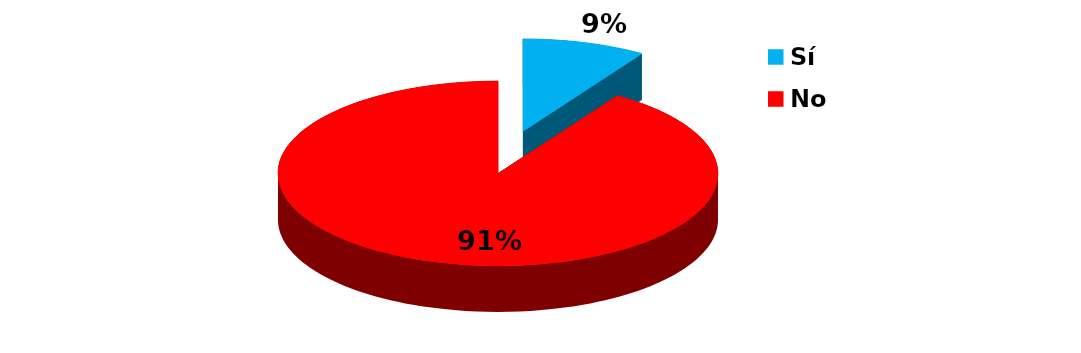
| Category | Series 0 |
|---|---|
| Sí | 2 |
| No | 20 |